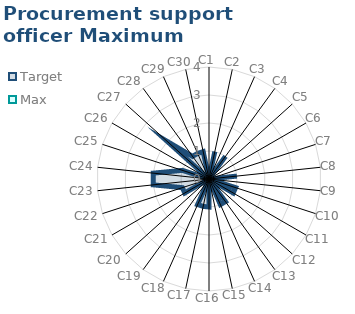
| Category | Target | Max |
|---|---|---|
| C1 | 0 | 0 |
| C2 | 1 | 0 |
| C3 | 0 | 0 |
| C4 | 1 | 0 |
| C5 | 0 | 0 |
| C6 | 0 | 0 |
| C7 | 0 | 0 |
| C8 | 1 | 0 |
| C9 | 0 | 0 |
| C10 | 1 | 0 |
| C11 | 1 | 0 |
| C12 | 0 | 0 |
| C13 | 1 | 0 |
| C14 | 1 | 0 |
| C15 | 0 | 0 |
| C16 | 1 | 0 |
| C17 | 1 | 0 |
| C18 | 1 | 0 |
| C19 | 0 | 0 |
| C20 | 0 | 0 |
| C21 | 1 | 0 |
| C22 | 1 | 0 |
| C23 | 2 | 0 |
| C24 | 2 | 0 |
| C25 | 1 | 0 |
| C26 | 0 | 0 |
| C27 | 2 | 0 |
| C28 | 1 | 0 |
| C29 | 1 | 0 |
| C30 | 1 | 0 |